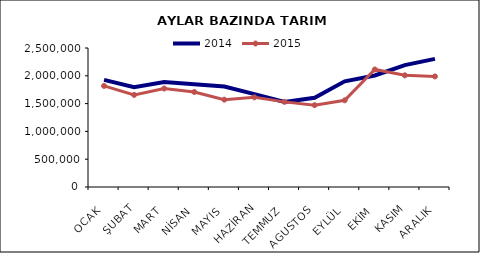
| Category | 2014 | 2015 |
|---|---|---|
| OCAK | 1927675.247 | 1818006.123 |
| ŞUBAT | 1795561.752 | 1656502.335 |
| MART | 1887609.371 | 1771355.034 |
| NİSAN | 1849082.73 | 1708926.692 |
| MAYIS | 1808337.595 | 1570570.999 |
| HAZİRAN | 1669475.923 | 1612151.266 |
| TEMMUZ | 1529345.393 | 1531039.864 |
| AGUSTOS | 1605840.063 | 1471719.916 |
| EYLÜL | 1901080.726 | 1558917.678 |
| EKİM | 2006039.826 | 2114042.402 |
| KASIM | 2192775.245 | 2008629.302 |
| ARALIK | 2304329.889 | 1988605.232 |